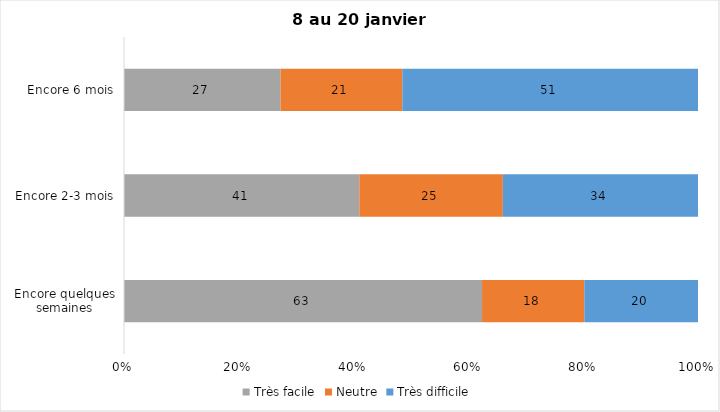
| Category | Très facile | Neutre | Très difficile |
|---|---|---|---|
| Encore quelques semaines | 63 | 18 | 20 |
| Encore 2-3 mois | 41 | 25 | 34 |
| Encore 6 mois | 27 | 21 | 51 |